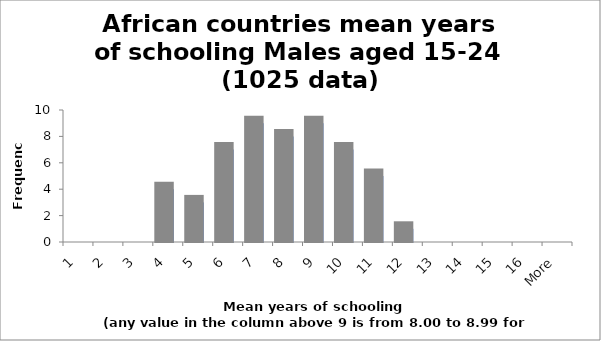
| Category | Frequency |
|---|---|
| 1 | 0 |
| 2 | 0 |
| 3 | 0 |
| 4 | 4 |
| 5 | 3 |
| 6 | 7 |
| 7 | 9 |
| 8 | 8 |
| 9 | 9 |
| 10 | 7 |
| 11 | 5 |
| 12 | 1 |
| 13 | 0 |
| 14 | 0 |
| 15 | 0 |
| 16 | 0 |
| More | 0 |